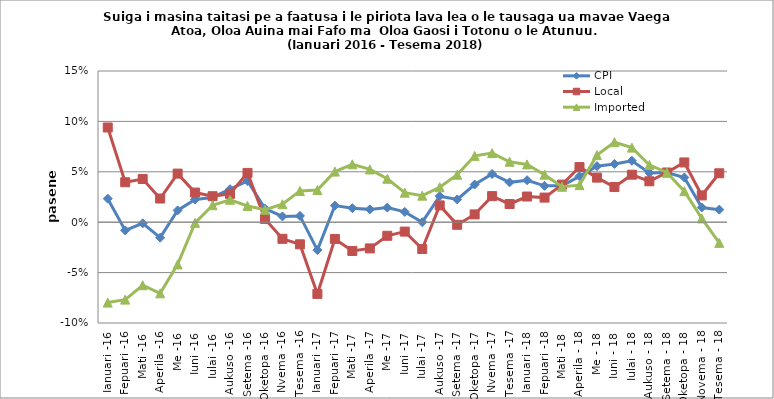
| Category | CPI | Local | Imported |
|---|---|---|---|
| Ianuari -16 | 0.023 | 0.094 | -0.08 |
| Fepuari -16 | -0.008 | 0.04 | -0.077 |
| Mati -16 | -0.001 | 0.043 | -0.063 |
| Aperila -16 | -0.015 | 0.023 | -0.071 |
| Me -16 | 0.012 | 0.048 | -0.042 |
| Iuni -16 | 0.023 | 0.029 | -0.001 |
| Iulai -16 | 0.025 | 0.026 | 0.017 |
| Aukuso -16 | 0.033 | 0.028 | 0.022 |
| Setema -16 | 0.041 | 0.049 | 0.016 |
| Oketopa -16 | 0.014 | 0.003 | 0.012 |
| Nvema -16 | 0.006 | -0.016 | 0.018 |
| Tesema -16 | 0.006 | -0.022 | 0.031 |
| Ianuari -17 | -0.028 | -0.071 | 0.032 |
| Fepuari -17 | 0.016 | -0.017 | 0.05 |
| Mati -17 | 0.014 | -0.029 | 0.057 |
| Aperila -17 | 0.013 | -0.026 | 0.052 |
| Me -17 | 0.015 | -0.013 | 0.043 |
| Iuni -17 | 0.01 | -0.009 | 0.029 |
| Iulai -17 | 0 | -0.027 | 0.026 |
| Aukuso -17 | 0.026 | 0.017 | 0.035 |
| Setema -17 | 0.023 | -0.003 | 0.047 |
| Oketopa -17 | 0.037 | 0.008 | 0.066 |
| Nvema -17 | 0.048 | 0.026 | 0.069 |
| Tesema -17 | 0.04 | 0.018 | 0.06 |
| Ianuari -18 | 0.042 | 0.025 | 0.057 |
| Fepuari -18 | 0.036 | 0.024 | 0.047 |
| Mati -18 | 0.036 | 0.037 | 0.035 |
| Aperila - 18 | 0.045 | 0.055 | 0.037 |
| Me - 18 | 0.056 | 0.044 | 0.067 |
| Iuni - 18 | 0.058 | 0.035 | 0.079 |
| Iulai - 18 | 0.061 | 0.047 | 0.074 |
| Aukuso - 18 | 0.049 | 0.041 | 0.057 |
| Setema - 18 | 0.049 | 0.049 | 0.049 |
| Oketopa - 18 | 0.044 | 0.059 | 0.031 |
| Novema - 18 | 0.015 | 0.027 | 0.004 |
| Tesema - 18 | 0.012 | 0.049 | -0.021 |